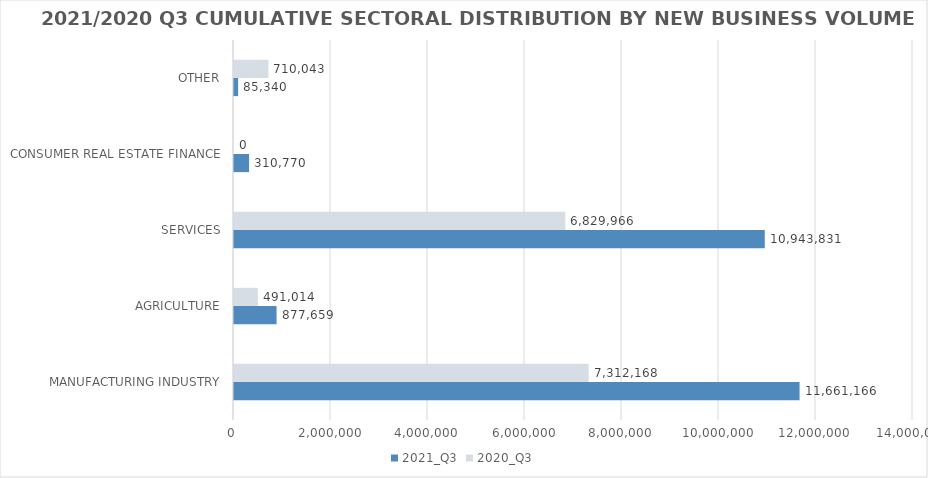
| Category | 2021_Q3 | 2020_Q3 |
|---|---|---|
| MANUFACTURING INDUSTRY | 11661165.52 | 7312168.18 |
| AGRICULTURE | 877659.164 | 491013.571 |
| SERVICES | 10943830.592 | 6829966.082 |
| CONSUMER REAL ESTATE FINANCE | 310770 | 0 |
| OTHER | 85340 | 710043.38 |